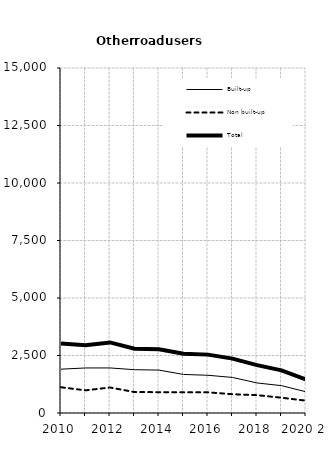
| Category | Built-up | Non built-up | Total |
|---|---|---|---|
| 2010 | 1905 | 1119 | 3024 |
| 2011 | 1958 | 985 | 2943 |
| 2012 | 1959 | 1109 | 3068 |
| 2013 | 1883 | 911 | 2794 |
| 2014 | 1865 | 906 | 2771 |
| 2015 | 1676 | 898 | 2574 |
| 2016 | 1640 | 898 | 2538 |
| 2017 | 1546 | 817 | 2363 |
| 2018 | 1307 | 776 | 2083 |
| 2019 2 | 1189 | 665 | 1854 |
| 2020 2 | 923 | 536 | 1459 |